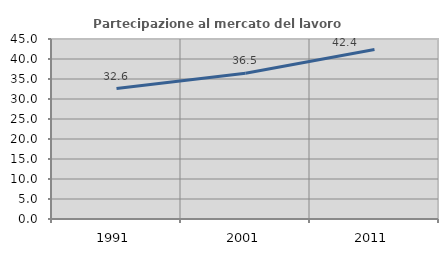
| Category | Partecipazione al mercato del lavoro  femminile |
|---|---|
| 1991.0 | 32.606 |
| 2001.0 | 36.452 |
| 2011.0 | 42.386 |